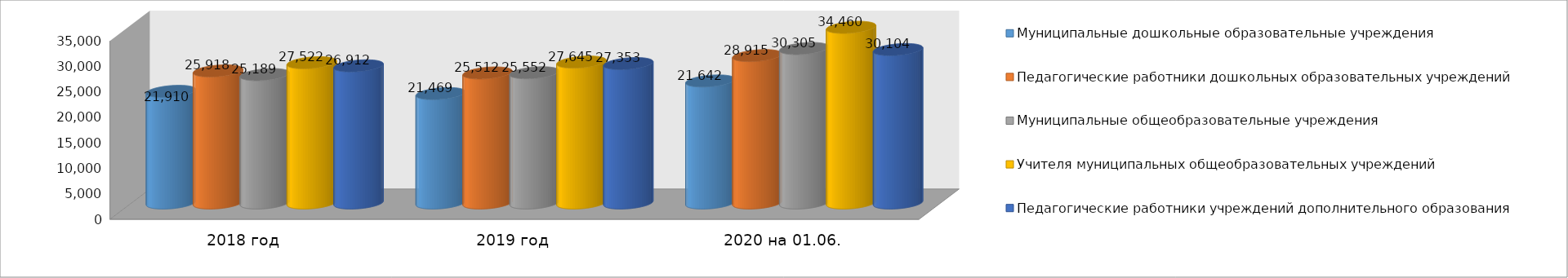
| Category | Муниципальные дошкольные образовательные учреждения | Педагогические работники дошкольных образовательных учреждений | Муниципальные общеобразовательные учреждения | Учителя муниципальных общеобразовательных учреждений | Педагогические работники учреждений дополнительного образования |
|---|---|---|---|---|---|
| 2018 год | 21910 | 25918 | 25189 | 27522 | 26912 |
| 2019 год | 21469 | 25512 | 25552 | 27645 | 27353 |
| 2020 на 01.06. | 23944 | 28915 | 30305 | 34460 | 30104 |